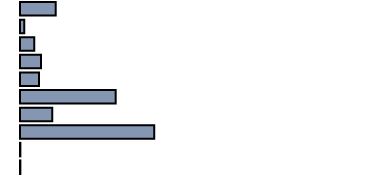
| Category | Series 0 |
|---|---|
| 0 | 10 |
| 1 | 1.2 |
| 2 | 4 |
| 3 | 5.9 |
| 4 | 5.3 |
| 5 | 26.8 |
| 6 | 9 |
| 7 | 37.6 |
| 8 | 0.1 |
| 9 | 0.1 |